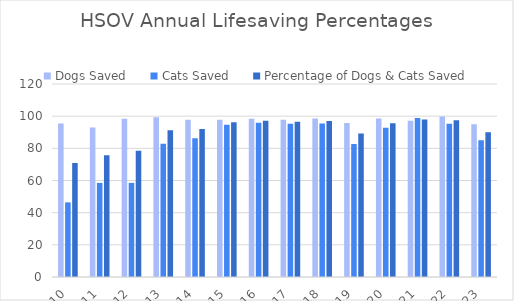
| Category | Dogs Saved | Cats Saved | Percentage of Dogs & Cats Saved |
|---|---|---|---|
| 0 | 95.4 | 46.4 | 70.9 |
| 1 | 92.9 | 58.5 | 75.7 |
| 2 | 98.4 | 58.5 | 78.5 |
| 3 | 99.4 | 82.9 | 91.2 |
| 4 | 97.7 | 86.3 | 92 |
| 5 | 97.8 | 94.6 | 96.2 |
| 6 | 98.4 | 95.9 | 97.2 |
| 7 | 97.8 | 95.3 | 96.6 |
| 8 | 98.5 | 95.5 | 97 |
| 9 | 95.8 | 82.7 | 89.25 |
| 10 | 98.5 | 92.8 | 95.6 |
| 11 | 97.2 | 98.8 | 98 |
| 12 | 99.8 | 95.3 | 97.5 |
| 13 | 95 | 85 | 90 |